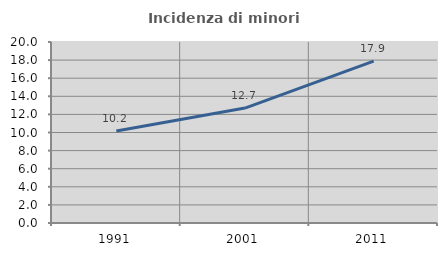
| Category | Incidenza di minori stranieri |
|---|---|
| 1991.0 | 10.169 |
| 2001.0 | 12.703 |
| 2011.0 | 17.896 |